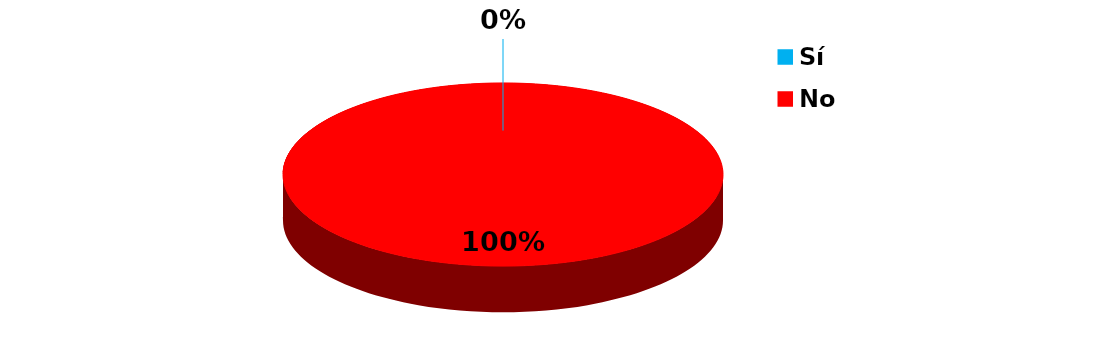
| Category | Series 0 |
|---|---|
| Sí | 0 |
| No | 13 |